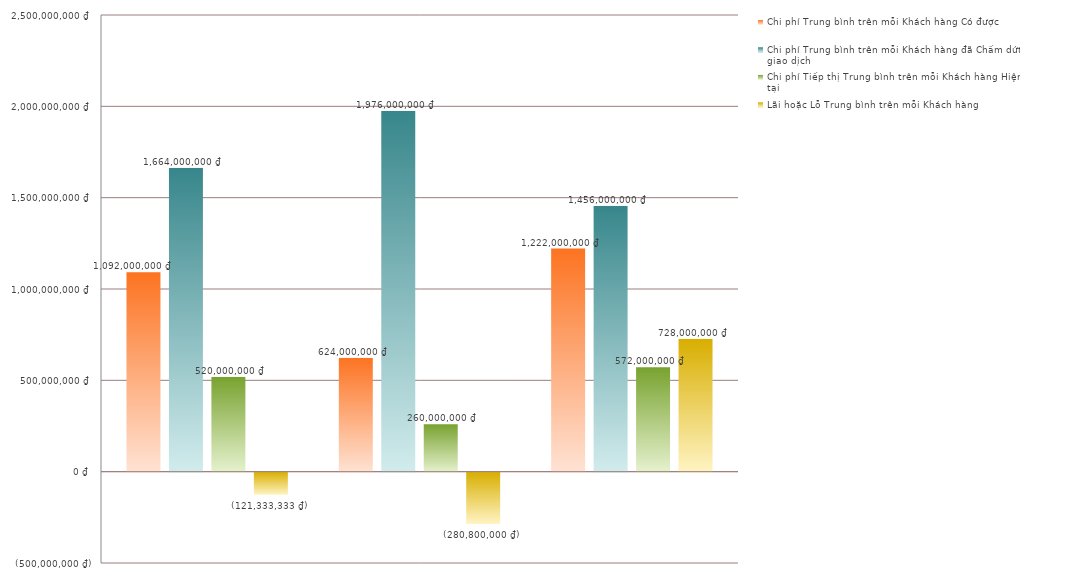
| Category | Chi phí Trung bình trên mỗi Khách hàng Có được | Chi phí Trung bình trên mỗi Khách hàng đã Chấm dứt giao dịch | Chi phí Tiếp thị Trung bình trên mỗi Khách hàng Hiện tại | Lãi hoặc Lỗ Trung bình trên mỗi Khách hàng |
|---|---|---|---|---|
|  | 1092000000 | 1664000000 | 520000000 | -121333333.333 |
|  | 624000000 | 1976000000 | 260000000 | -280800000 |
|  | 1222000000 | 1456000000 | 572000000 | 728000000 |